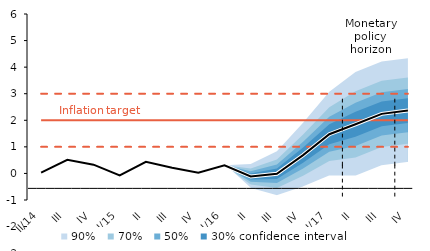
| Category | Inflation Target | Inflation Target - lower bound | Inflation Target - upper bound | linka | Střed předpovědi |
|---|---|---|---|---|---|
| II/14 | 2 | 1 | 3 | 0.032 | 0.032 |
| III | 2 | 1 | 3 | 0.511 | 0.511 |
| IV | 2 | 1 | 3 | 0.329 | 0.329 |
| I/15 | 2 | 1 | 3 | -0.076 | -0.076 |
| II | 2 | 1 | 3 | 0.439 | 0.439 |
| III | 2 | 1 | 3 | 0.212 | 0.212 |
| IV | 2 | 1 | 3 | 0.028 | 0.028 |
| I/16 | 2 | 1 | 3 | 0.305 | 0.305 |
| II | 2 | 1 | 3 | -0.116 | -0.116 |
| III | 2 | 1 | 3 | -0.011 | -0.011 |
| IV | 2 | 1 | 3 | 0.689 | 0.689 |
| I/17 | 2 | 1 | 3 | 1.476 | 1.476 |
| II | 2 | 1 | 3 | 1.849 | 1.849 |
| III | 2 | 1 | 3 | 2.242 | 2.242 |
| IV | 2 | 1 | 3 | 2.365 | 2.365 |